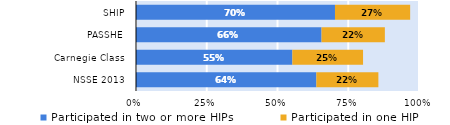
| Category | Participated in two or more HIPs | Participated in one HIP |
|---|---|---|
| NSSE 2013 | 0.637 | 0.219 |
| Carnegie Class | 0.552 | 0.25 |
| PASSHE | 0.656 | 0.224 |
| SHIP | 0.703 | 0.266 |